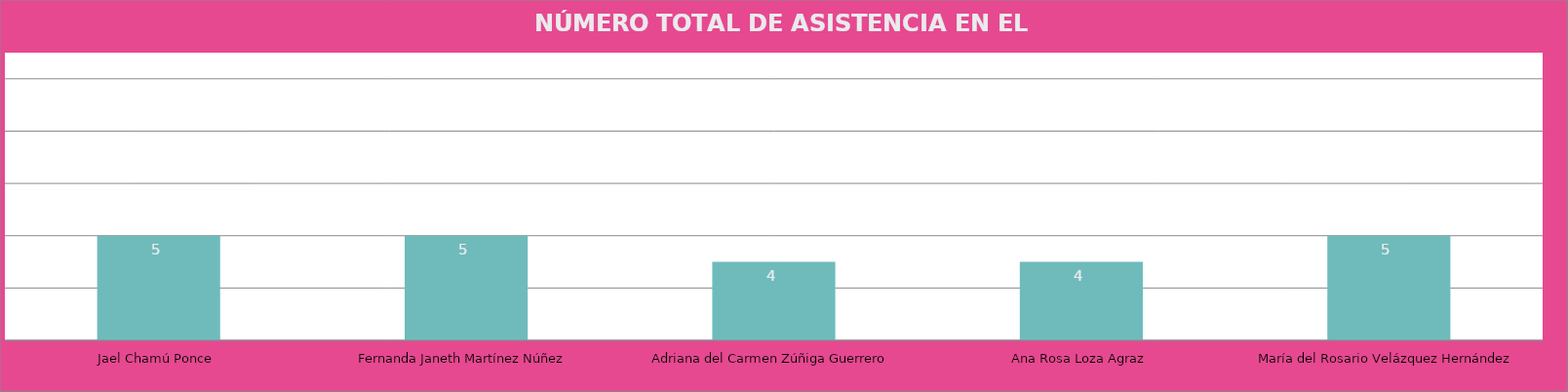
| Category | Series 0 |
|---|---|
| Jael Chamú Ponce | 5 |
| Fernanda Janeth Martínez Núñez | 5 |
| Adriana del Carmen Zúñiga Guerrero | 4 |
| Ana Rosa Loza Agraz | 4 |
| María del Rosario Velázquez Hernández | 5 |